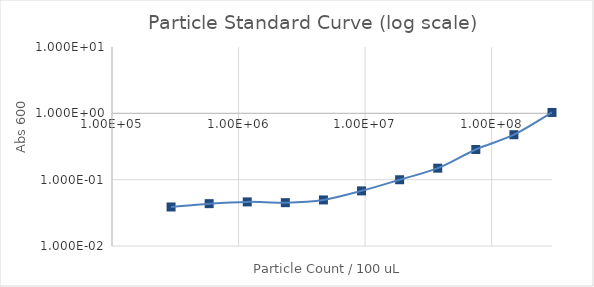
| Category | Series 1 |
|---|---|
| 300000000.0 | 1.031 |
| 150000000.0 | 0.476 |
| 75000000.0 | 0.285 |
| 37500000.0 | 0.149 |
| 18750000.0 | 0.1 |
| 9375000.0 | 0.068 |
| 4687500.0 | 0.05 |
| 2343750.0 | 0.045 |
| 1171875.0 | 0.046 |
| 585937.5 | 0.044 |
| 292968.75 | 0.039 |